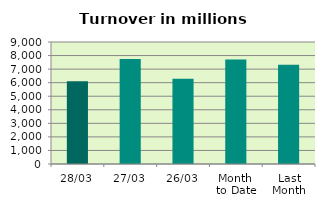
| Category | Series 0 |
|---|---|
| 28/03 | 6112.142 |
| 27/03 | 7750.835 |
| 26/03 | 6280.76 |
| Month 
to Date | 7705.934 |
| Last
Month | 7315.261 |